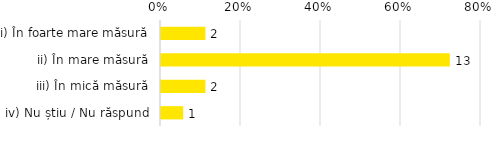
| Category | Total |
|---|---|
| i) În foarte mare măsură | 0.111 |
| ii) În mare măsură | 0.722 |
| iii) În mică măsură | 0.111 |
| iv) Nu știu / Nu răspund | 0.056 |